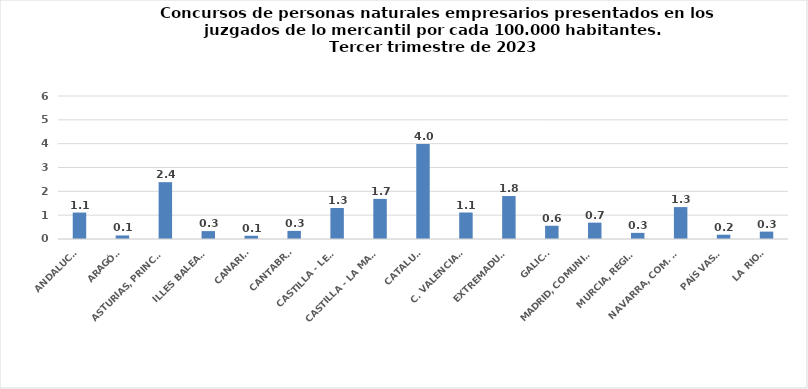
| Category | Series 0 |
|---|---|
| ANDALUCÍA | 1.109 |
| ARAGÓN | 0.148 |
| ASTURIAS, PRINCIPADO | 2.384 |
| ILLES BALEARS | 0.331 |
| CANARIAS | 0.136 |
| CANTABRIA | 0.34 |
| CASTILLA - LEÓN | 1.301 |
| CASTILLA - LA MANCHA | 1.682 |
| CATALUÑA | 3.988 |
| C. VALENCIANA | 1.111 |
| EXTREMADURA | 1.802 |
| GALICIA | 0.556 |
| MADRID, COMUNIDAD | 0.686 |
| MURCIA, REGIÓN | 0.258 |
| NAVARRA, COM. FORAL | 1.339 |
| PAÍS VASCO | 0.18 |
| LA RIOJA | 0.31 |